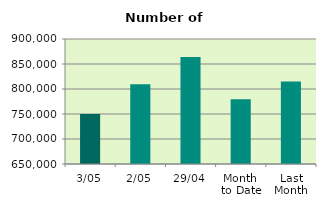
| Category | Series 0 |
|---|---|
| 3/05 | 750016 |
| 2/05 | 809430 |
| 29/04 | 863976 |
| Month 
to Date | 779723 |
| Last
Month | 814883.684 |